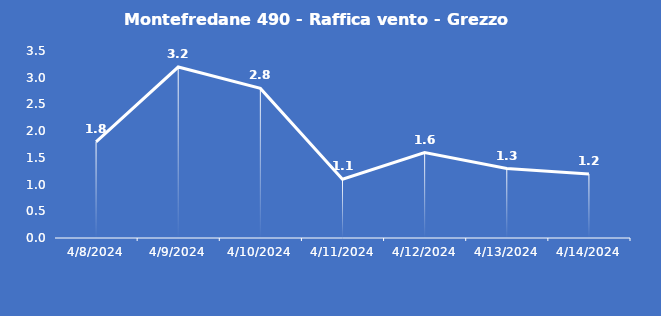
| Category | Montefredane 490 - Raffica vento - Grezzo (m/s) |
|---|---|
| 4/8/24 | 1.8 |
| 4/9/24 | 3.2 |
| 4/10/24 | 2.8 |
| 4/11/24 | 1.1 |
| 4/12/24 | 1.6 |
| 4/13/24 | 1.3 |
| 4/14/24 | 1.2 |